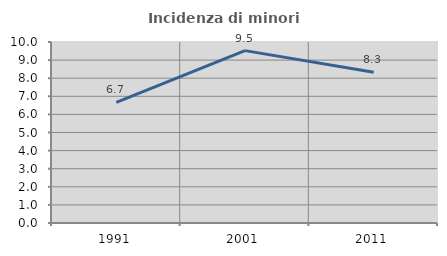
| Category | Incidenza di minori stranieri |
|---|---|
| 1991.0 | 6.667 |
| 2001.0 | 9.524 |
| 2011.0 | 8.333 |